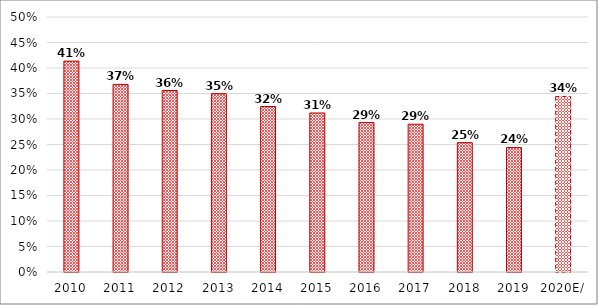
| Category | Series 0 |
|---|---|
| 2010 | 0.413 |
| 2011 | 0.368 |
| 2012 | 0.356 |
| 2013 | 0.35 |
| 2014 | 0.324 |
| 2015 | 0.312 |
| 2016 | 0.293 |
| 2017 | 0.29 |
| 2018 | 0.254 |
| 2019 | 0.244 |
| 2020E/ | 0.344 |